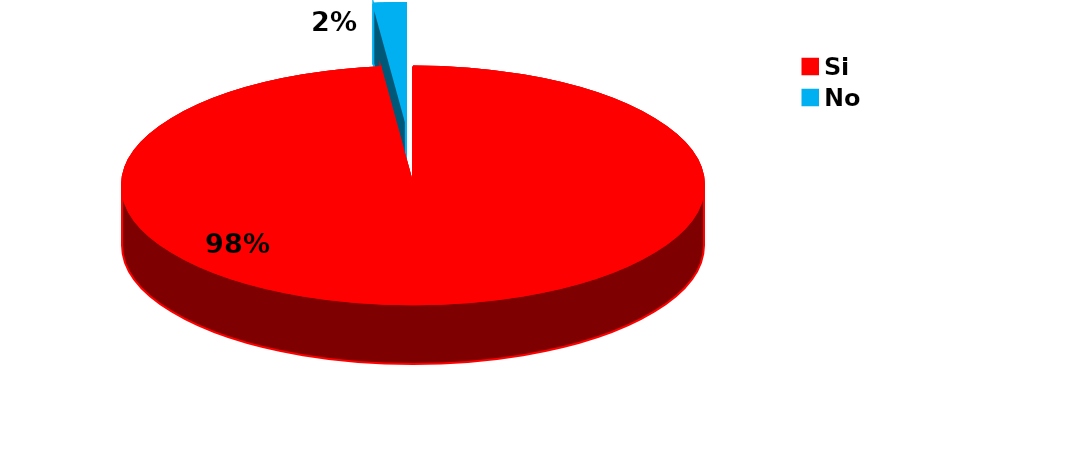
| Category | Series 0 |
|---|---|
| Si | 110 |
| No | 2 |